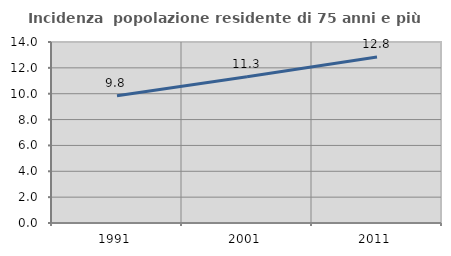
| Category | Incidenza  popolazione residente di 75 anni e più |
|---|---|
| 1991.0 | 9.846 |
| 2001.0 | 11.305 |
| 2011.0 | 12.841 |